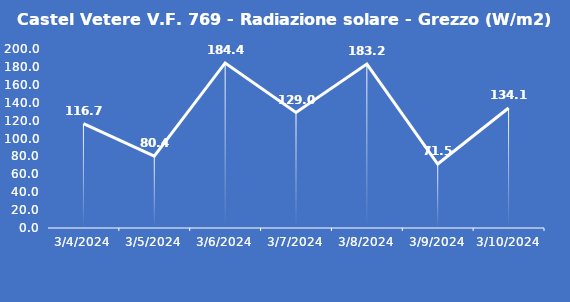
| Category | Castel Vetere V.F. 769 - Radiazione solare - Grezzo (W/m2) |
|---|---|
| 3/4/24 | 116.7 |
| 3/5/24 | 80.4 |
| 3/6/24 | 184.4 |
| 3/7/24 | 129 |
| 3/8/24 | 183.2 |
| 3/9/24 | 71.5 |
| 3/10/24 | 134.1 |